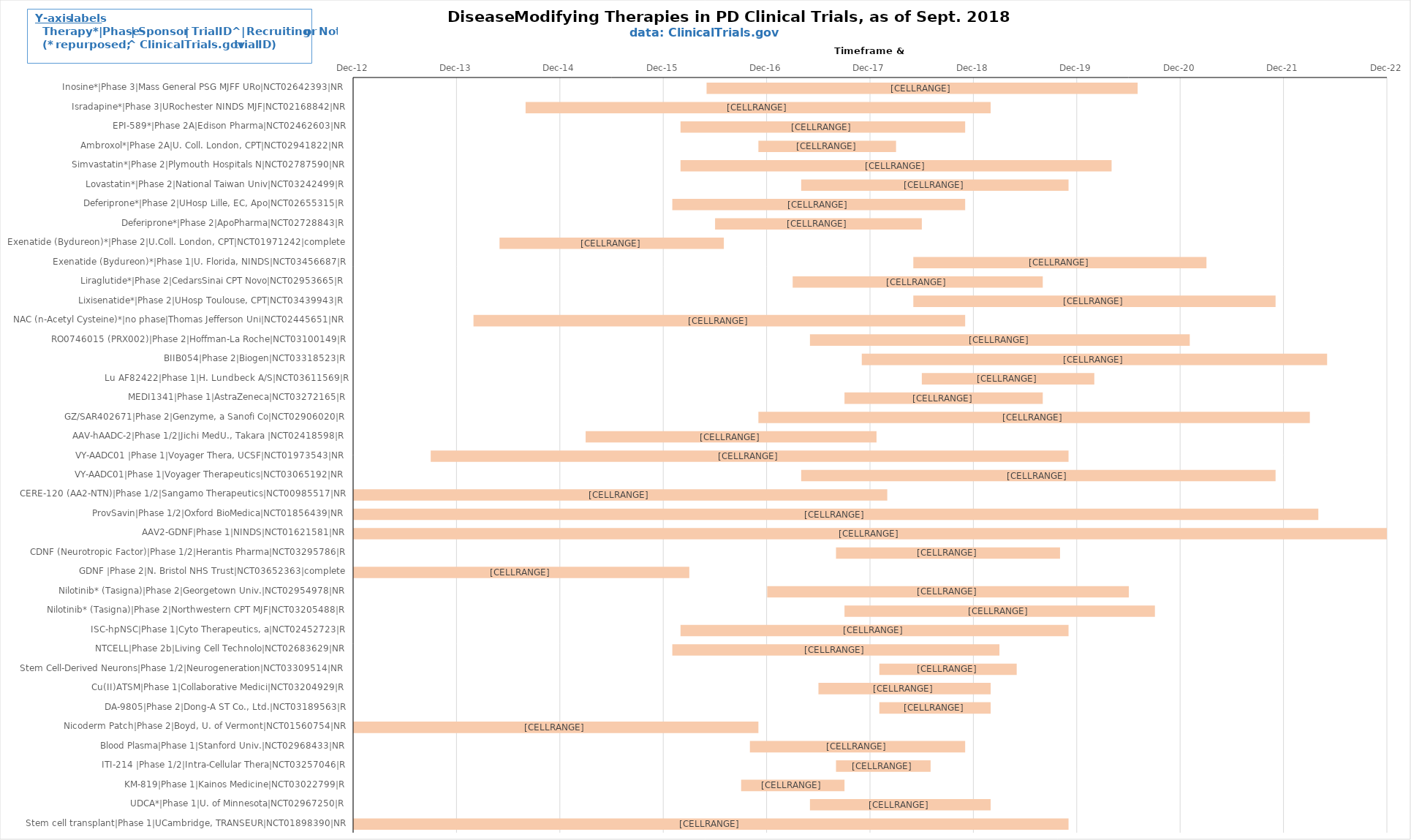
| Category | Study start date | Study duration in days |
|---|---|---|
| Inosine*|Phase 3|Mass General PSG MJFF URo|NCT02642393|NR | 2016-06-01 | 1522 |
| Isradapine*|Phase 3|URochester NINDS MJF|NCT02168842|NR | 2014-09-01 | 1642 |
| EPI-589*|Phase 2A|Edison Pharma|NCT02462603|NR | 2016-03-01 | 1005 |
| Ambroxol*|Phase 2A|U. Coll. London, CPT|NCT02941822|NR | 2016-12-01 | 486 |
| Simvastatin*|Phase 2|Plymouth Hospitals N|NCT02787590|NR | 2016-03-01 | 1522 |
| Lovastatin*|Phase 2|National Taiwan Univ|NCT03242499|R | 2017-05-01 | 944 |
| Deferiprone*|Phase 2|UHosp Lille, EC, Apo|NCT02655315|R | 2016-02-01 | 1034 |
| Deferiprone*|Phase 2|ApoPharma|NCT02728843|R | 2016-07-01 | 730 |
| Exenatide (Bydureon)*|Phase 2|U.Coll. London, CPT|NCT01971242|complete | 2014-06-01 | 792 |
| Exenatide (Bydureon)*|Phase 1|U. Florida, NINDS|NCT03456687|R | 2018-06-01 | 1035 |
| Liraglutide*|Phase 2|CedarsSinai CPT Novo|NCT02953665|R | 2017-04-01 | 883 |
| Lixisenatide*|Phase 2|UHosp Toulouse, CPT|NCT03439943|R | 2018-06-01 | 1279 |
| NAC (n-Acetyl Cysteine)*|no phase|Thomas Jefferson Uni|NCT02445651|NR | 2014-03-01 | 1736 |
| RO0746015 (PRX002)|Phase 2|Hoffman-La Roche|NCT03100149|R | 2017-06-01 | 1341 |
| BIIB054|Phase 2|Biogen|NCT03318523|R | 2017-12-01 | 1643 |
| Lu AF82422|Phase 1|H. Lundbeck A/S|NCT03611569|R | 2018-07-01 | 609 |
| MEDI1341|Phase 1|AstraZeneca|NCT03272165|R | 2017-10-01 | 700 |
| GZ/SAR402671|Phase 2|Genzyme, a Sanofi Co|NCT02906020|R | 2016-12-01 | 1947 |
| AAV-hAADC-2|Phase 1/2|Jichi MedU., Takara |NCT02418598|R | 2015-04-01 | 1027 |
| VY-AADC01 |Phase 1|Voyager Thera, UCSF|NCT01973543|NR | 2013-10-01 | 2252 |
| VY-AADC01|Phase 1|Voyager Therapeutics|NCT03065192|NR | 2017-05-01 | 1675 |
| CERE-120 (AA2-NTN)|Phase 1/2|Sangamo Therapeutics|NCT00985517|NR | 2009-09-01 | 3103 |
| ProvSavin|Phase 1/2|Oxford BioMedica|NCT01856439|NR | 2011-05-01 | 4018 |
| AAV2-GDNF|Phase 1|NINDS|NCT01621581|NR | 2012-05-01 | 5692 |
| CDNF (Neurotropic Factor)|Phase 1/2|Herantis Pharma|NCT03295786|R | 2017-09-01 | 791 |
| GDNF |Phase 2|N. Bristol NHS Trust|NCT03652363|complete | 2012-10-01 | 1278 |
| Nilotinib* (Tasigna)|Phase 2|Georgetown Univ.|NCT02954978|NR | 2017-01-01 | 1277 |
| Nilotinib* (Tasigna)|Phase 2|Northwestern CPT MJF|NCT03205488|R | 2017-10-01 | 1096 |
| ISC-hpNSC|Phase 1|Cyto Therapeutics, a|NCT02452723|R | 2016-03-01 | 1370 |
| NTCELL|Phase 2b|Living Cell Technolo|NCT02683629|NR | 2016-02-01 | 1155 |
| Stem Cell-Derived Neurons|Phase 1/2|Neurogeneration|NCT03309514|NR | 2018-02-01 | 485 |
| Cu(II)ATSM|Phase 1|Collaborative Medici|NCT03204929|R | 2017-07-01 | 608 |
| DA-9805|Phase 2|Dong-A ST Co., Ltd.|NCT03189563|R | 2018-02-01 | 393 |
| Nicoderm Patch|Phase 2|Boyd, U. of Vermont|NCT01560754|NR | 2012-10-01 | 1522 |
| Blood Plasma|Phase 1|Stanford Univ.|NCT02968433|NR | 2016-11-01 | 760 |
| ITI-214 |Phase 1/2|Intra-Cellular Thera|NCT03257046|R | 2017-09-01 | 334 |
| KM-819|Phase 1|Kainos Medicine|NCT03022799|R | 2016-10-01 | 365 |
| UDCA*|Phase 1|U. of Minnesota|NCT02967250|R | 2017-06-01 | 638 |
| Stem cell transplant|Phase 1|UCambridge, TRANSEUR|NCT01898390|NR | 2012-05-01 | 2770 |